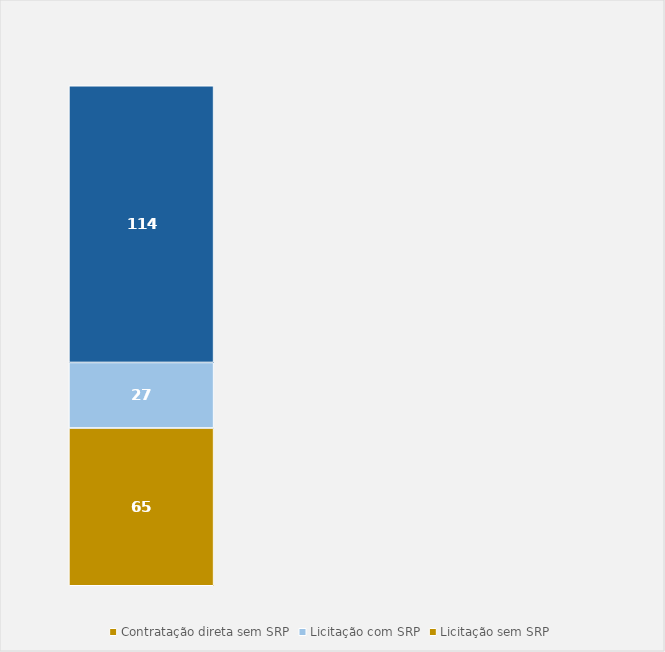
| Category | Contratação direta sem SRP | Licitação com SRP | Licitação sem SRP |
|---|---|---|---|
| Total | 65 | 27 | 114 |